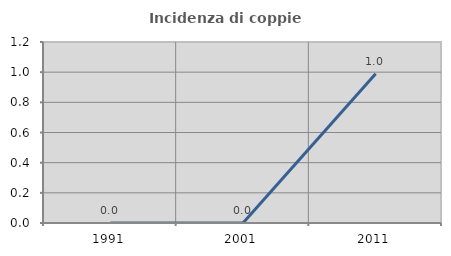
| Category | Incidenza di coppie miste |
|---|---|
| 1991.0 | 0 |
| 2001.0 | 0 |
| 2011.0 | 0.99 |